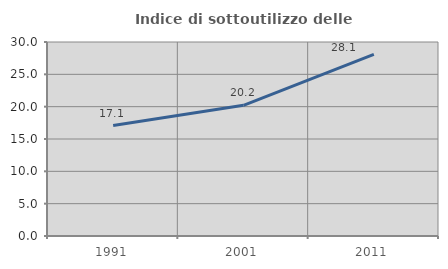
| Category | Indice di sottoutilizzo delle abitazioni  |
|---|---|
| 1991.0 | 17.076 |
| 2001.0 | 20.209 |
| 2011.0 | 28.081 |